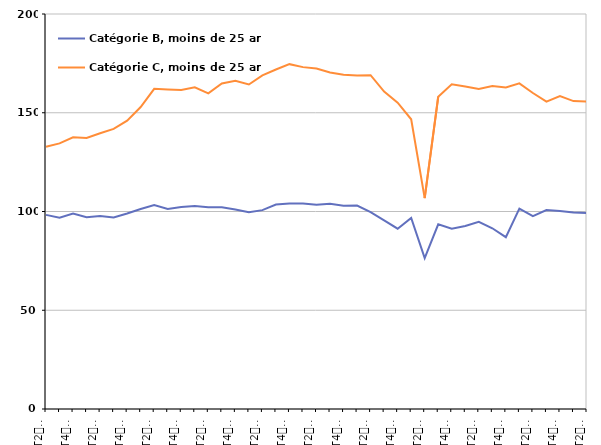
| Category | Catégorie B, moins de 25 ans | Catégorie C, moins de 25 ans |
|---|---|---|
| T2
2013 | 98.3 | 132.8 |
| T3
2013 | 96.8 | 134.5 |
| T4
2013 | 99 | 137.6 |
| T1
2014 | 97.1 | 137.2 |
| T2
2014 | 97.7 | 139.6 |
| T3
2014 | 97 | 141.8 |
| T4
2014 | 99 | 146 |
| T1
2015 | 101.3 | 152.9 |
| T2
2015 | 103.3 | 162.1 |
| T3
2015 | 101.3 | 161.8 |
| T4
2015 | 102.3 | 161.5 |
| T1
2016 | 102.8 | 162.9 |
| T2
2016 | 102.2 | 159.8 |
| T3
2016 | 102.1 | 164.8 |
| T4
2016 | 101 | 166.2 |
| T1
2017 | 99.6 | 164.3 |
| T2
2017 | 100.7 | 168.9 |
| T3
2017 | 103.5 | 171.9 |
| T4
2017 | 104 | 174.6 |
| T1
2018 | 104 | 173.1 |
| T2
2018 | 103.4 | 172.4 |
| T3
2018 | 103.9 | 170.4 |
| T4
2018 | 102.9 | 169.3 |
| T1
2019 | 103 | 168.9 |
| T2
2019 | 99.7 | 169 |
| T3
2019 | 95.5 | 160.7 |
| T4
2019 | 91.3 | 155.1 |
| T1
2020 | 96.7 | 146.7 |
| T2
2020 | 76.4 | 106.8 |
| T3
2020 | 93.5 | 158.1 |
| T4
2020 | 91.3 | 164.4 |
| T1
2021 | 92.7 | 163.3 |
| T2
2021 | 94.8 | 162 |
| T3
2021 | 91.5 | 163.5 |
| T4
2021 | 87 | 162.8 |
| T1
2022 | 101.5 | 164.9 |
| T2
2022 | 97.7 | 160 |
| T3
2022 | 100.7 | 155.6 |
| T4
2022 | 100.3 | 158.4 |
| T1
2023 | 99.5 | 155.9 |
| T2
2023 | 99.2 | 155.7 |